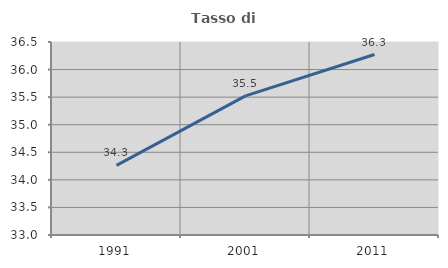
| Category | Tasso di occupazione   |
|---|---|
| 1991.0 | 34.263 |
| 2001.0 | 35.523 |
| 2011.0 | 36.273 |